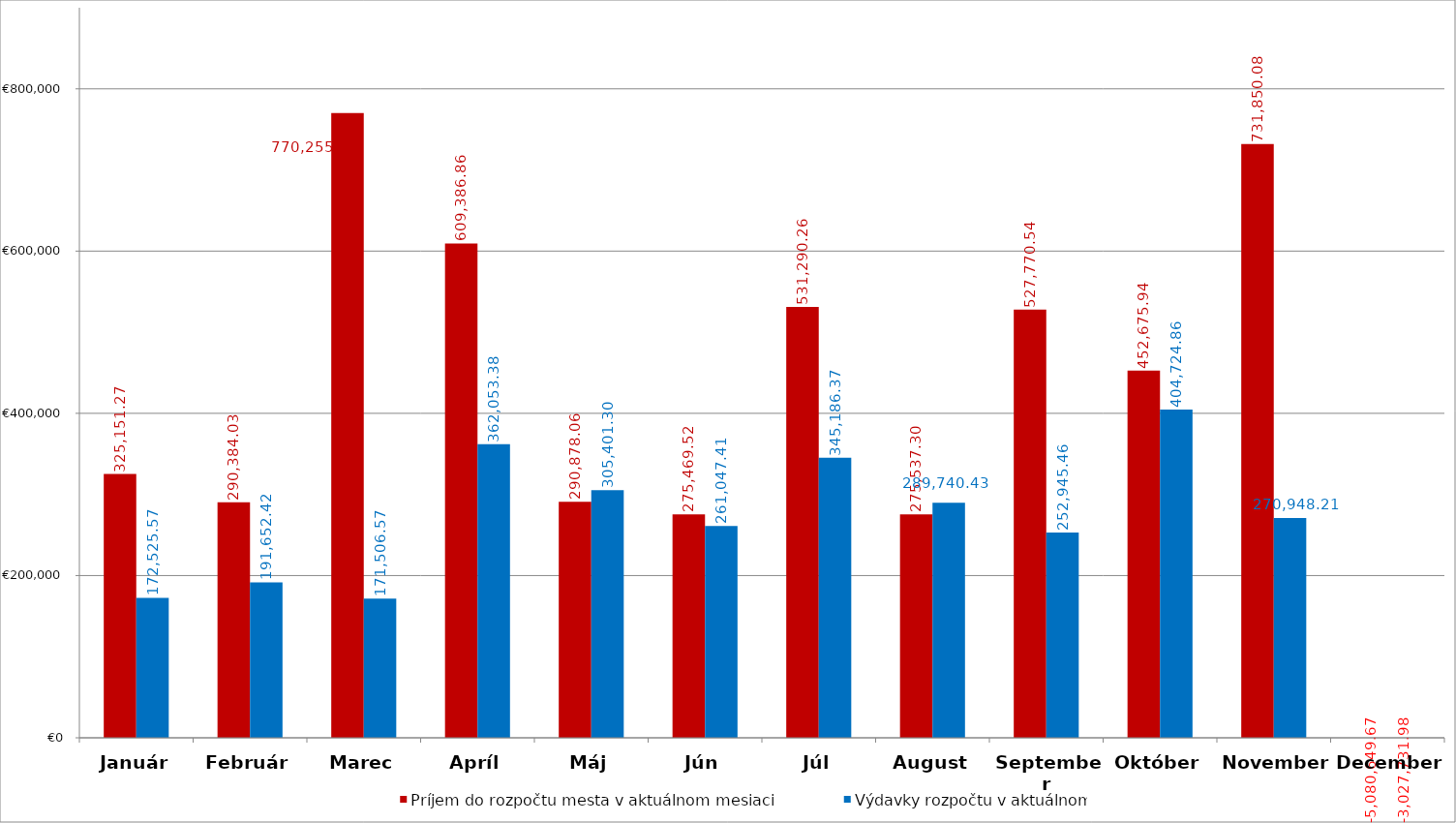
| Category | Príjem do rozpočtu mesta v aktuálnom mesiaci | Výdavky rozpočtu v aktuálnom  mesiaci |
|---|---|---|
| Január | 325151.27 | 172525.57 |
| Február | 290384.03 | 191652.42 |
| Marec | 770255.81 | 171506.57 |
| Apríl | 609386.86 | 362053.38 |
| Máj | 290878.06 | 305401.3 |
| Jún | 275469.52 | 261047.41 |
| Júl | 531290.26 | 345186.37 |
| August | 275537.3 | 289740.43 |
| September | 527770.54 | 252945.46 |
| Október | 452675.94 | 404724.86 |
| November | 731850.08 | 270948.21 |
| December | -5080649.67 | -3027731.98 |